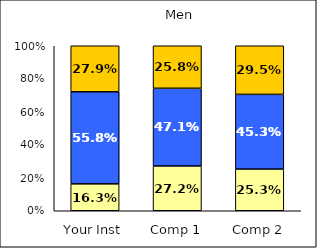
| Category | Low Social Agency | Average Social Agency | High Social Agency |
|---|---|---|---|
| Your Inst | 0.163 | 0.558 | 0.279 |
| Comp 1 | 0.272 | 0.471 | 0.258 |
| Comp 2 | 0.253 | 0.453 | 0.295 |